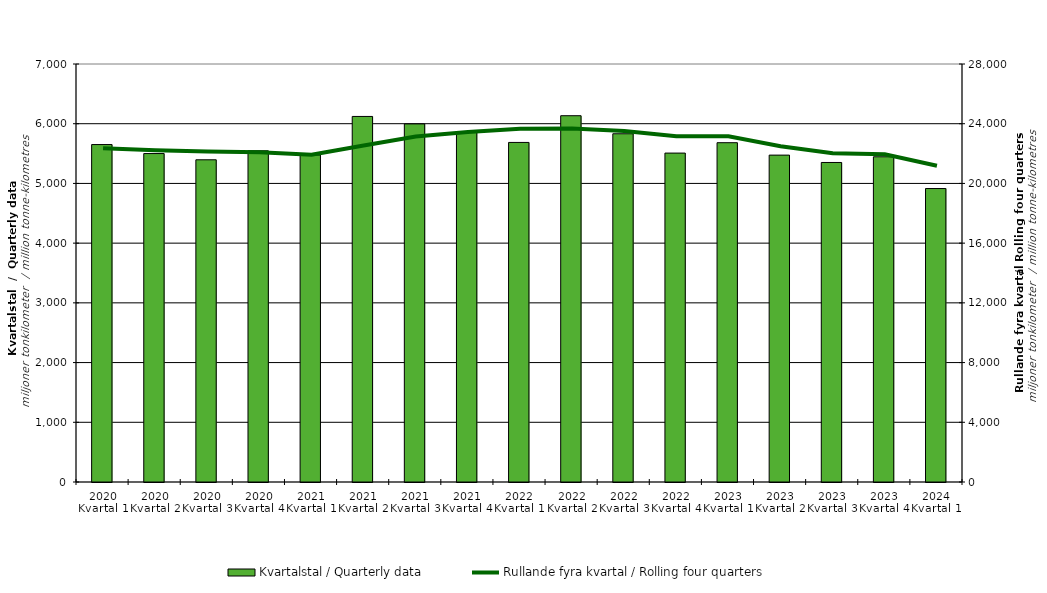
| Category | Kvartalstal / Quarterly data |
|---|---|
| 2020 Kvartal 1 | 5650.915 |
| 2020 Kvartal 2 | 5500.334 |
| 2020 Kvartal 3 | 5395.987 |
| 2020 Kvartal 4 | 5546.662 |
| 2021 Kvartal 1 | 5476.427 |
| 2021 Kvartal 2 | 6121.807 |
| 2021 Kvartal 3 | 5996.688 |
| 2021 Kvartal 4 | 5853.966 |
| 2022 Kvartal 1 | 5686.696 |
| 2022 Kvartal 2 | 6134.1 |
| 2022 Kvartal 3 | 5831.909 |
| 2022 Kvartal 4 | 5508.231 |
| 2023 Kvartal 1 | 5682.15 |
| 2023 Kvartal 2 | 5474.069 |
| 2023 Kvartal 3 | 5350.838 |
| 2023 Kvartal 4 | 5446.325 |
| 2024 Kvartal 1 | 4914.302 |